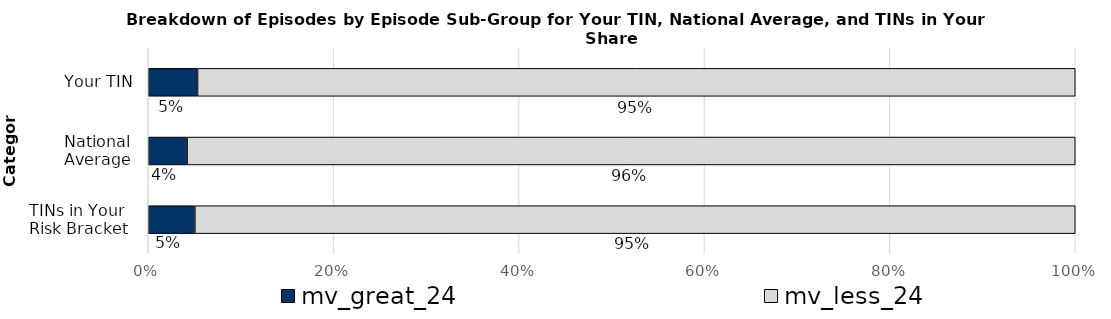
| Category | mv_great_24 | mv_less_24 |
|---|---|---|
| Your TIN | 0.053 | 0.947 |
| National
Average | 0.042 | 0.958 |
| TINs in Your 
Risk Bracket | 0.05 | 0.95 |